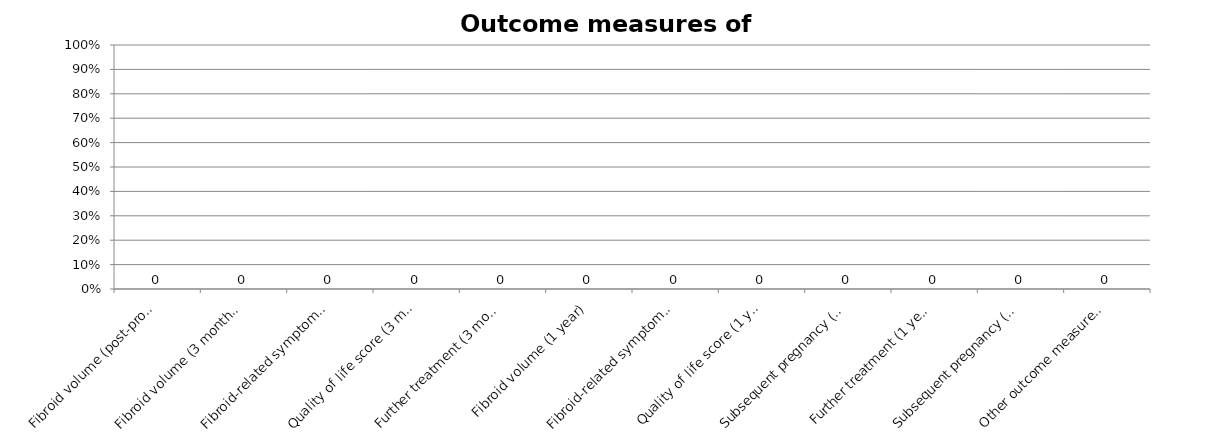
| Category | Series 0 |
|---|---|
| Fibroid volume (post-procedure) | 0 |
| Fibroid volume (3 months) | 0 |
| Fibroid-related symptom score (3 months) | 0 |
| Quality of life score (3 months) | 0 |
| Further treatment (3 months) | 0 |
| Fibroid volume (1 year) | 0 |
| Fibroid-related symptom score (1 year) | 0 |
| Quality of life score (1 year) | 0 |
| Subsequent pregnancy (1 year) | 0 |
| Further treatment (1 year) | 0 |
| Subsequent pregnancy (5 years) | 0 |
| Other outcome measure of benefit | 0 |